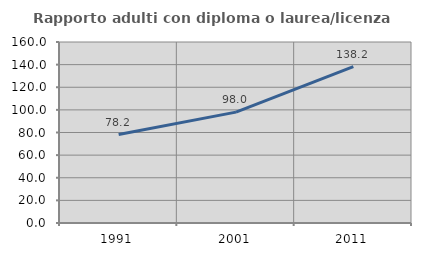
| Category | Rapporto adulti con diploma o laurea/licenza media  |
|---|---|
| 1991.0 | 78.151 |
| 2001.0 | 98.016 |
| 2011.0 | 138.246 |